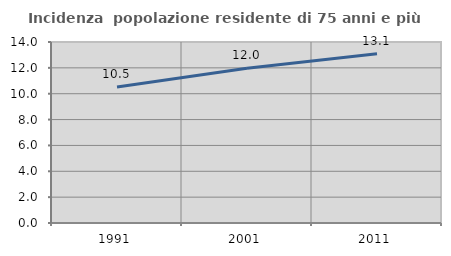
| Category | Incidenza  popolazione residente di 75 anni e più |
|---|---|
| 1991.0 | 10.526 |
| 2001.0 | 11.973 |
| 2011.0 | 13.084 |